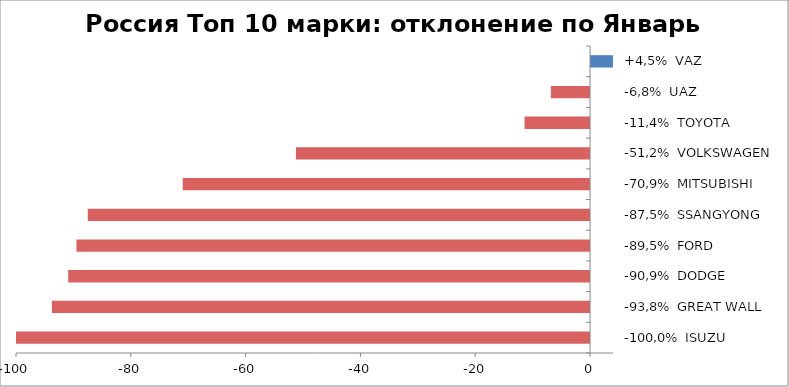
| Category | Россия Топ 10 марки: отклонение по Январь 2016-2015 |
|---|---|
| -100,0%  ISUZU | -100 |
| -93,8%  GREAT WALL | -93.75 |
| -90,9%  DODGE | -90.909 |
| -89,5%  FORD | -89.474 |
| -87,5%  SSANGYONG | -87.5 |
| -70,9%  MITSUBISHI | -70.949 |
| -51,2%  VOLKSWAGEN | -51.24 |
| -11,4%  TOYOTA | -11.413 |
| -6,8%  UAZ | -6.818 |
| +4,5%  VAZ | 4.545 |